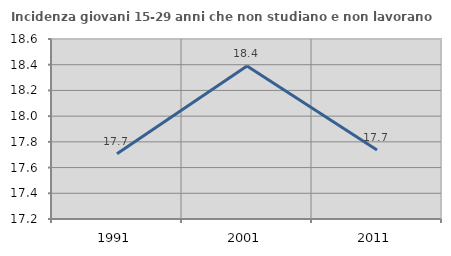
| Category | Incidenza giovani 15-29 anni che non studiano e non lavorano  |
|---|---|
| 1991.0 | 17.708 |
| 2001.0 | 18.389 |
| 2011.0 | 17.736 |